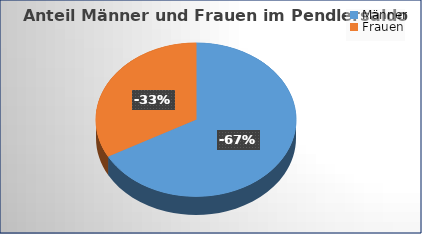
| Category | Series 0 |
|---|---|
| 0 | -6418 |
| 1 | -3161 |